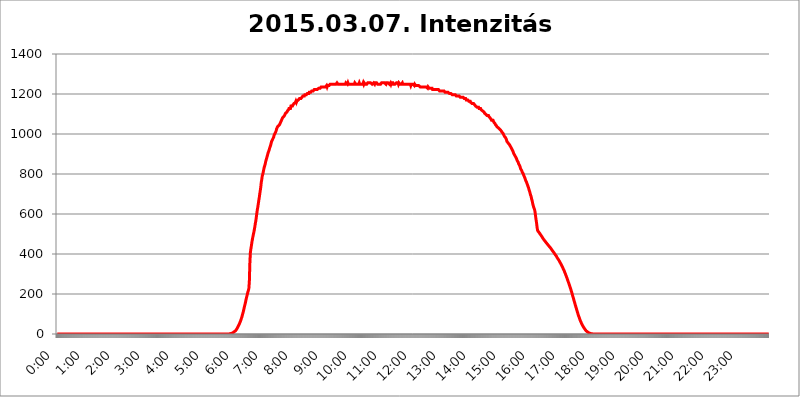
| Category | 2015.03.07. Intenzitás [W/m^2] |
|---|---|
| 0.0 | -0.256 |
| 0.0006944444444444445 | -0.256 |
| 0.001388888888888889 | -0.256 |
| 0.0020833333333333333 | -0.256 |
| 0.002777777777777778 | -0.256 |
| 0.003472222222222222 | -0.256 |
| 0.004166666666666667 | -0.256 |
| 0.004861111111111111 | -0.256 |
| 0.005555555555555556 | -0.256 |
| 0.0062499999999999995 | -0.256 |
| 0.006944444444444444 | -0.256 |
| 0.007638888888888889 | -0.256 |
| 0.008333333333333333 | -0.256 |
| 0.009027777777777779 | -0.256 |
| 0.009722222222222222 | -0.256 |
| 0.010416666666666666 | -0.256 |
| 0.011111111111111112 | -0.256 |
| 0.011805555555555555 | -0.256 |
| 0.012499999999999999 | -0.256 |
| 0.013194444444444444 | -0.256 |
| 0.013888888888888888 | -0.256 |
| 0.014583333333333332 | -0.256 |
| 0.015277777777777777 | -0.256 |
| 0.015972222222222224 | -0.256 |
| 0.016666666666666666 | -0.256 |
| 0.017361111111111112 | -0.256 |
| 0.018055555555555557 | -0.256 |
| 0.01875 | -0.256 |
| 0.019444444444444445 | -0.256 |
| 0.02013888888888889 | -0.256 |
| 0.020833333333333332 | -0.256 |
| 0.02152777777777778 | -0.256 |
| 0.022222222222222223 | -0.256 |
| 0.02291666666666667 | -0.256 |
| 0.02361111111111111 | -0.256 |
| 0.024305555555555556 | -0.256 |
| 0.024999999999999998 | -0.256 |
| 0.025694444444444447 | -0.256 |
| 0.02638888888888889 | -0.256 |
| 0.027083333333333334 | -0.256 |
| 0.027777777777777776 | -0.256 |
| 0.02847222222222222 | -0.256 |
| 0.029166666666666664 | -0.256 |
| 0.029861111111111113 | -0.256 |
| 0.030555555555555555 | -0.256 |
| 0.03125 | -0.256 |
| 0.03194444444444445 | -0.256 |
| 0.03263888888888889 | -0.256 |
| 0.03333333333333333 | -0.256 |
| 0.034027777777777775 | -0.256 |
| 0.034722222222222224 | -0.256 |
| 0.035416666666666666 | -0.256 |
| 0.036111111111111115 | -0.256 |
| 0.03680555555555556 | -0.256 |
| 0.0375 | -0.256 |
| 0.03819444444444444 | -0.256 |
| 0.03888888888888889 | -0.256 |
| 0.03958333333333333 | -0.256 |
| 0.04027777777777778 | -0.256 |
| 0.04097222222222222 | -0.256 |
| 0.041666666666666664 | -0.256 |
| 0.042361111111111106 | -0.256 |
| 0.04305555555555556 | -0.256 |
| 0.043750000000000004 | -0.256 |
| 0.044444444444444446 | -0.256 |
| 0.04513888888888889 | -0.256 |
| 0.04583333333333334 | -0.256 |
| 0.04652777777777778 | -0.256 |
| 0.04722222222222222 | -0.256 |
| 0.04791666666666666 | -0.256 |
| 0.04861111111111111 | -0.256 |
| 0.049305555555555554 | -0.256 |
| 0.049999999999999996 | -0.256 |
| 0.05069444444444445 | -0.256 |
| 0.051388888888888894 | -0.256 |
| 0.052083333333333336 | -0.256 |
| 0.05277777777777778 | -0.256 |
| 0.05347222222222222 | -0.256 |
| 0.05416666666666667 | -0.256 |
| 0.05486111111111111 | -0.256 |
| 0.05555555555555555 | -0.256 |
| 0.05625 | -0.256 |
| 0.05694444444444444 | -0.256 |
| 0.057638888888888885 | -0.256 |
| 0.05833333333333333 | -0.256 |
| 0.05902777777777778 | -0.256 |
| 0.059722222222222225 | -0.256 |
| 0.06041666666666667 | -0.256 |
| 0.061111111111111116 | -0.256 |
| 0.06180555555555556 | -0.256 |
| 0.0625 | -0.256 |
| 0.06319444444444444 | -0.256 |
| 0.06388888888888888 | -0.256 |
| 0.06458333333333334 | -0.256 |
| 0.06527777777777778 | -0.256 |
| 0.06597222222222222 | -0.256 |
| 0.06666666666666667 | -0.256 |
| 0.06736111111111111 | -0.256 |
| 0.06805555555555555 | -0.256 |
| 0.06874999999999999 | -0.256 |
| 0.06944444444444443 | -0.256 |
| 0.07013888888888889 | -0.256 |
| 0.07083333333333333 | -0.256 |
| 0.07152777777777779 | -0.256 |
| 0.07222222222222223 | -0.256 |
| 0.07291666666666667 | -0.256 |
| 0.07361111111111111 | -0.256 |
| 0.07430555555555556 | -0.256 |
| 0.075 | -0.256 |
| 0.07569444444444444 | -0.256 |
| 0.0763888888888889 | -0.256 |
| 0.07708333333333334 | -0.256 |
| 0.07777777777777778 | -0.256 |
| 0.07847222222222222 | -0.256 |
| 0.07916666666666666 | -0.256 |
| 0.0798611111111111 | -0.256 |
| 0.08055555555555556 | -0.256 |
| 0.08125 | -0.256 |
| 0.08194444444444444 | -0.256 |
| 0.08263888888888889 | -0.256 |
| 0.08333333333333333 | -0.256 |
| 0.08402777777777777 | -0.256 |
| 0.08472222222222221 | -0.256 |
| 0.08541666666666665 | -0.256 |
| 0.08611111111111112 | -0.256 |
| 0.08680555555555557 | -0.256 |
| 0.08750000000000001 | -0.256 |
| 0.08819444444444445 | -0.256 |
| 0.08888888888888889 | -0.256 |
| 0.08958333333333333 | -0.256 |
| 0.09027777777777778 | -0.256 |
| 0.09097222222222222 | -0.256 |
| 0.09166666666666667 | -0.256 |
| 0.09236111111111112 | -0.256 |
| 0.09305555555555556 | -0.256 |
| 0.09375 | -0.256 |
| 0.09444444444444444 | -0.256 |
| 0.09513888888888888 | -0.256 |
| 0.09583333333333333 | -0.256 |
| 0.09652777777777777 | -0.256 |
| 0.09722222222222222 | -0.256 |
| 0.09791666666666667 | -0.256 |
| 0.09861111111111111 | -0.256 |
| 0.09930555555555555 | -0.256 |
| 0.09999999999999999 | -0.256 |
| 0.10069444444444443 | -0.256 |
| 0.1013888888888889 | -0.256 |
| 0.10208333333333335 | -0.256 |
| 0.10277777777777779 | -0.256 |
| 0.10347222222222223 | -0.256 |
| 0.10416666666666667 | -0.256 |
| 0.10486111111111111 | -0.256 |
| 0.10555555555555556 | -0.256 |
| 0.10625 | -0.256 |
| 0.10694444444444444 | -0.256 |
| 0.1076388888888889 | -0.256 |
| 0.10833333333333334 | -0.256 |
| 0.10902777777777778 | -0.256 |
| 0.10972222222222222 | -0.256 |
| 0.1111111111111111 | -0.256 |
| 0.11180555555555556 | -0.256 |
| 0.11180555555555556 | -0.256 |
| 0.1125 | -0.256 |
| 0.11319444444444444 | -0.256 |
| 0.11388888888888889 | -0.256 |
| 0.11458333333333333 | -0.256 |
| 0.11527777777777777 | -0.256 |
| 0.11597222222222221 | -0.256 |
| 0.11666666666666665 | -0.256 |
| 0.1173611111111111 | -0.256 |
| 0.11805555555555557 | -0.256 |
| 0.11944444444444445 | -0.256 |
| 0.12013888888888889 | -0.256 |
| 0.12083333333333333 | -0.256 |
| 0.12152777777777778 | -0.256 |
| 0.12222222222222223 | -0.256 |
| 0.12291666666666667 | -0.256 |
| 0.12291666666666667 | -0.256 |
| 0.12361111111111112 | -0.256 |
| 0.12430555555555556 | -0.256 |
| 0.125 | -0.256 |
| 0.12569444444444444 | -0.256 |
| 0.12638888888888888 | -0.256 |
| 0.12708333333333333 | -0.256 |
| 0.16875 | -0.256 |
| 0.12847222222222224 | -0.256 |
| 0.12916666666666668 | -0.256 |
| 0.12986111111111112 | -0.256 |
| 0.13055555555555556 | -0.256 |
| 0.13125 | -0.256 |
| 0.13194444444444445 | -0.256 |
| 0.1326388888888889 | -0.256 |
| 0.13333333333333333 | -0.256 |
| 0.13402777777777777 | -0.256 |
| 0.13402777777777777 | -0.256 |
| 0.13472222222222222 | -0.256 |
| 0.13541666666666666 | -0.256 |
| 0.1361111111111111 | -0.256 |
| 0.13749999999999998 | -0.256 |
| 0.13819444444444443 | -0.256 |
| 0.1388888888888889 | -0.256 |
| 0.13958333333333334 | -0.256 |
| 0.14027777777777778 | -0.256 |
| 0.14097222222222222 | -0.256 |
| 0.14166666666666666 | -0.256 |
| 0.1423611111111111 | -0.256 |
| 0.14305555555555557 | -0.256 |
| 0.14375000000000002 | -0.256 |
| 0.14444444444444446 | -0.256 |
| 0.1451388888888889 | -0.256 |
| 0.1451388888888889 | -0.256 |
| 0.14652777777777778 | -0.256 |
| 0.14722222222222223 | -0.256 |
| 0.14791666666666667 | -0.256 |
| 0.1486111111111111 | -0.256 |
| 0.14930555555555555 | -0.256 |
| 0.15 | -0.256 |
| 0.15069444444444444 | -0.256 |
| 0.15138888888888888 | -0.256 |
| 0.15208333333333332 | -0.256 |
| 0.15277777777777776 | -0.256 |
| 0.15347222222222223 | -0.256 |
| 0.15416666666666667 | -0.256 |
| 0.15486111111111112 | -0.256 |
| 0.15555555555555556 | -0.256 |
| 0.15625 | -0.256 |
| 0.15694444444444444 | -0.256 |
| 0.15763888888888888 | -0.256 |
| 0.15833333333333333 | -0.256 |
| 0.15902777777777777 | -0.256 |
| 0.15972222222222224 | -0.256 |
| 0.16041666666666668 | -0.256 |
| 0.16111111111111112 | -0.256 |
| 0.16180555555555556 | -0.256 |
| 0.1625 | -0.256 |
| 0.16319444444444445 | -0.256 |
| 0.1638888888888889 | -0.256 |
| 0.16458333333333333 | -0.256 |
| 0.16527777777777777 | -0.256 |
| 0.16597222222222222 | -0.256 |
| 0.16666666666666666 | -0.256 |
| 0.1673611111111111 | -0.256 |
| 0.16805555555555554 | -0.256 |
| 0.16874999999999998 | -0.256 |
| 0.16944444444444443 | -0.256 |
| 0.17013888888888887 | -0.256 |
| 0.1708333333333333 | -0.256 |
| 0.17152777777777775 | -0.256 |
| 0.17222222222222225 | -0.256 |
| 0.1729166666666667 | -0.256 |
| 0.17361111111111113 | -0.256 |
| 0.17430555555555557 | -0.256 |
| 0.17500000000000002 | -0.256 |
| 0.17569444444444446 | -0.256 |
| 0.1763888888888889 | -0.256 |
| 0.17708333333333334 | -0.256 |
| 0.17777777777777778 | -0.256 |
| 0.17847222222222223 | -0.256 |
| 0.17916666666666667 | -0.256 |
| 0.1798611111111111 | -0.256 |
| 0.18055555555555555 | -0.256 |
| 0.18125 | -0.256 |
| 0.18194444444444444 | -0.256 |
| 0.1826388888888889 | -0.256 |
| 0.18333333333333335 | -0.256 |
| 0.1840277777777778 | -0.256 |
| 0.18472222222222223 | -0.256 |
| 0.18541666666666667 | -0.256 |
| 0.18611111111111112 | -0.256 |
| 0.18680555555555556 | -0.256 |
| 0.1875 | -0.256 |
| 0.18819444444444444 | -0.256 |
| 0.18888888888888888 | -0.256 |
| 0.18958333333333333 | -0.256 |
| 0.19027777777777777 | -0.256 |
| 0.1909722222222222 | -0.256 |
| 0.19166666666666665 | -0.256 |
| 0.19236111111111112 | -0.256 |
| 0.19305555555555554 | -0.256 |
| 0.19375 | -0.256 |
| 0.19444444444444445 | -0.256 |
| 0.1951388888888889 | -0.256 |
| 0.19583333333333333 | -0.256 |
| 0.19652777777777777 | -0.256 |
| 0.19722222222222222 | -0.256 |
| 0.19791666666666666 | -0.256 |
| 0.1986111111111111 | -0.256 |
| 0.19930555555555554 | -0.256 |
| 0.19999999999999998 | -0.256 |
| 0.20069444444444443 | -0.256 |
| 0.20138888888888887 | -0.256 |
| 0.2020833333333333 | -0.256 |
| 0.2027777777777778 | -0.256 |
| 0.2034722222222222 | -0.256 |
| 0.2041666666666667 | -0.256 |
| 0.20486111111111113 | -0.256 |
| 0.20555555555555557 | -0.256 |
| 0.20625000000000002 | -0.256 |
| 0.20694444444444446 | -0.256 |
| 0.2076388888888889 | -0.256 |
| 0.20833333333333334 | -0.256 |
| 0.20902777777777778 | -0.256 |
| 0.20972222222222223 | -0.256 |
| 0.21041666666666667 | -0.256 |
| 0.2111111111111111 | -0.256 |
| 0.21180555555555555 | -0.256 |
| 0.2125 | -0.256 |
| 0.21319444444444444 | -0.256 |
| 0.2138888888888889 | -0.256 |
| 0.21458333333333335 | -0.256 |
| 0.2152777777777778 | -0.256 |
| 0.21597222222222223 | -0.256 |
| 0.21666666666666667 | -0.256 |
| 0.21736111111111112 | -0.256 |
| 0.21805555555555556 | -0.256 |
| 0.21875 | -0.256 |
| 0.21944444444444444 | -0.256 |
| 0.22013888888888888 | -0.256 |
| 0.22083333333333333 | -0.256 |
| 0.22152777777777777 | -0.256 |
| 0.2222222222222222 | -0.256 |
| 0.22291666666666665 | -0.256 |
| 0.2236111111111111 | -0.256 |
| 0.22430555555555556 | -0.256 |
| 0.225 | -0.256 |
| 0.22569444444444445 | -0.256 |
| 0.2263888888888889 | -0.256 |
| 0.22708333333333333 | -0.256 |
| 0.22777777777777777 | -0.256 |
| 0.22847222222222222 | -0.256 |
| 0.22916666666666666 | -0.256 |
| 0.2298611111111111 | -0.256 |
| 0.23055555555555554 | -0.256 |
| 0.23124999999999998 | -0.256 |
| 0.23194444444444443 | -0.256 |
| 0.23263888888888887 | -0.256 |
| 0.2333333333333333 | -0.256 |
| 0.2340277777777778 | -0.256 |
| 0.2347222222222222 | -0.256 |
| 0.2354166666666667 | -0.256 |
| 0.23611111111111113 | -0.256 |
| 0.23680555555555557 | -0.256 |
| 0.23750000000000002 | -0.256 |
| 0.23819444444444446 | -0.256 |
| 0.2388888888888889 | -0.256 |
| 0.23958333333333334 | -0.256 |
| 0.24027777777777778 | -0.256 |
| 0.24097222222222223 | 1.09 |
| 0.24166666666666667 | 1.09 |
| 0.2423611111111111 | 1.09 |
| 0.24305555555555555 | 2.439 |
| 0.24375 | 2.439 |
| 0.24444444444444446 | 3.791 |
| 0.24513888888888888 | 3.791 |
| 0.24583333333333335 | 5.146 |
| 0.2465277777777778 | 6.503 |
| 0.24722222222222223 | 7.862 |
| 0.24791666666666667 | 10.589 |
| 0.24861111111111112 | 11.956 |
| 0.24930555555555556 | 14.696 |
| 0.25 | 16.069 |
| 0.25069444444444444 | 20.201 |
| 0.2513888888888889 | 22.965 |
| 0.2520833333333333 | 27.124 |
| 0.25277777777777777 | 31.297 |
| 0.2534722222222222 | 35.483 |
| 0.25416666666666665 | 41.081 |
| 0.2548611111111111 | 45.29 |
| 0.2555555555555556 | 50.914 |
| 0.25625000000000003 | 57.958 |
| 0.2569444444444445 | 63.6 |
| 0.2576388888888889 | 70.658 |
| 0.25833333333333336 | 79.125 |
| 0.2590277777777778 | 86.175 |
| 0.25972222222222224 | 96.022 |
| 0.2604166666666667 | 104.435 |
| 0.2611111111111111 | 114.207 |
| 0.26180555555555557 | 125.304 |
| 0.2625 | 136.314 |
| 0.26319444444444445 | 145.865 |
| 0.2638888888888889 | 156.678 |
| 0.26458333333333334 | 168.703 |
| 0.2652777777777778 | 179.258 |
| 0.2659722222222222 | 189.685 |
| 0.26666666666666666 | 199.98 |
| 0.2673611111111111 | 210.144 |
| 0.26805555555555555 | 217.681 |
| 0.26875 | 227.618 |
| 0.26944444444444443 | 263.851 |
| 0.2701388888888889 | 352.423 |
| 0.2708333333333333 | 406.25 |
| 0.27152777777777776 | 424.085 |
| 0.2722222222222222 | 439.982 |
| 0.27291666666666664 | 456.747 |
| 0.2736111111111111 | 471.198 |
| 0.2743055555555555 | 484.662 |
| 0.27499999999999997 | 496.965 |
| 0.27569444444444446 | 507.927 |
| 0.27638888888888885 | 521.237 |
| 0.27708333333333335 | 535.145 |
| 0.2777777777777778 | 551.823 |
| 0.27847222222222223 | 564.917 |
| 0.2791666666666667 | 583.206 |
| 0.2798611111111111 | 602.505 |
| 0.28055555555555556 | 620.273 |
| 0.28125 | 633.495 |
| 0.28194444444444444 | 649.973 |
| 0.2826388888888889 | 667.146 |
| 0.2833333333333333 | 682.011 |
| 0.28402777777777777 | 700.54 |
| 0.2847222222222222 | 716.58 |
| 0.28541666666666665 | 733.184 |
| 0.28611111111111115 | 757.414 |
| 0.28680555555555554 | 771.794 |
| 0.28750000000000003 | 790.334 |
| 0.2881944444444445 | 797.931 |
| 0.2888888888888889 | 809.522 |
| 0.28958333333333336 | 821.353 |
| 0.2902777777777778 | 833.43 |
| 0.29097222222222224 | 841.619 |
| 0.2916666666666667 | 849.92 |
| 0.2923611111111111 | 862.585 |
| 0.29305555555555557 | 866.865 |
| 0.29375 | 879.878 |
| 0.29444444444444445 | 888.701 |
| 0.2951388888888889 | 893.157 |
| 0.29583333333333334 | 906.707 |
| 0.2965277777777778 | 911.285 |
| 0.2972222222222222 | 920.533 |
| 0.29791666666666666 | 929.905 |
| 0.2986111111111111 | 934.639 |
| 0.29930555555555555 | 944.201 |
| 0.3 | 949.03 |
| 0.30069444444444443 | 963.712 |
| 0.3013888888888889 | 968.671 |
| 0.3020833333333333 | 973.663 |
| 0.30277777777777776 | 978.688 |
| 0.3034722222222222 | 983.747 |
| 0.30416666666666664 | 993.965 |
| 0.3048611111111111 | 993.965 |
| 0.3055555555555555 | 1004.318 |
| 0.30624999999999997 | 1009.546 |
| 0.3069444444444444 | 1014.809 |
| 0.3076388888888889 | 1025.437 |
| 0.30833333333333335 | 1025.437 |
| 0.3090277777777778 | 1036.206 |
| 0.30972222222222223 | 1036.206 |
| 0.3104166666666667 | 1041.644 |
| 0.3111111111111111 | 1041.644 |
| 0.31180555555555556 | 1047.117 |
| 0.3125 | 1052.625 |
| 0.31319444444444444 | 1058.17 |
| 0.3138888888888889 | 1058.17 |
| 0.3145833333333333 | 1069.368 |
| 0.31527777777777777 | 1075.021 |
| 0.3159722222222222 | 1080.711 |
| 0.31666666666666665 | 1080.711 |
| 0.31736111111111115 | 1086.439 |
| 0.31805555555555554 | 1086.439 |
| 0.31875000000000003 | 1092.203 |
| 0.3194444444444445 | 1092.203 |
| 0.3201388888888889 | 1103.843 |
| 0.32083333333333336 | 1103.843 |
| 0.3215277777777778 | 1103.843 |
| 0.32222222222222224 | 1109.72 |
| 0.3229166666666667 | 1115.634 |
| 0.3236111111111111 | 1115.634 |
| 0.32430555555555557 | 1121.587 |
| 0.325 | 1127.578 |
| 0.32569444444444445 | 1127.578 |
| 0.3263888888888889 | 1127.578 |
| 0.32708333333333334 | 1127.578 |
| 0.3277777777777778 | 1139.675 |
| 0.3284722222222222 | 1139.675 |
| 0.32916666666666666 | 1139.675 |
| 0.3298611111111111 | 1139.675 |
| 0.33055555555555555 | 1145.782 |
| 0.33125 | 1145.782 |
| 0.33194444444444443 | 1151.928 |
| 0.3326388888888889 | 1151.928 |
| 0.3333333333333333 | 1151.928 |
| 0.3340277777777778 | 1158.113 |
| 0.3347222222222222 | 1164.337 |
| 0.3354166666666667 | 1158.113 |
| 0.3361111111111111 | 1164.337 |
| 0.3368055555555556 | 1164.337 |
| 0.33749999999999997 | 1164.337 |
| 0.33819444444444446 | 1170.601 |
| 0.33888888888888885 | 1170.601 |
| 0.33958333333333335 | 1176.905 |
| 0.34027777777777773 | 1176.905 |
| 0.34097222222222223 | 1176.905 |
| 0.3416666666666666 | 1176.905 |
| 0.3423611111111111 | 1176.905 |
| 0.3430555555555555 | 1183.249 |
| 0.34375 | 1183.249 |
| 0.3444444444444445 | 1189.633 |
| 0.3451388888888889 | 1189.633 |
| 0.3458333333333334 | 1189.633 |
| 0.34652777777777777 | 1189.633 |
| 0.34722222222222227 | 1196.058 |
| 0.34791666666666665 | 1196.058 |
| 0.34861111111111115 | 1196.058 |
| 0.34930555555555554 | 1196.058 |
| 0.35000000000000003 | 1196.058 |
| 0.3506944444444444 | 1202.523 |
| 0.3513888888888889 | 1202.523 |
| 0.3520833333333333 | 1202.523 |
| 0.3527777777777778 | 1202.523 |
| 0.3534722222222222 | 1209.029 |
| 0.3541666666666667 | 1209.029 |
| 0.3548611111111111 | 1209.029 |
| 0.35555555555555557 | 1209.029 |
| 0.35625 | 1209.029 |
| 0.35694444444444445 | 1215.576 |
| 0.3576388888888889 | 1215.576 |
| 0.35833333333333334 | 1215.576 |
| 0.3590277777777778 | 1215.576 |
| 0.3597222222222222 | 1215.576 |
| 0.36041666666666666 | 1222.164 |
| 0.3611111111111111 | 1222.164 |
| 0.36180555555555555 | 1222.164 |
| 0.3625 | 1222.164 |
| 0.36319444444444443 | 1222.164 |
| 0.3638888888888889 | 1222.164 |
| 0.3645833333333333 | 1222.164 |
| 0.3652777777777778 | 1222.164 |
| 0.3659722222222222 | 1222.164 |
| 0.3666666666666667 | 1228.794 |
| 0.3673611111111111 | 1228.794 |
| 0.3680555555555556 | 1228.794 |
| 0.36874999999999997 | 1228.794 |
| 0.36944444444444446 | 1228.794 |
| 0.37013888888888885 | 1235.465 |
| 0.37083333333333335 | 1235.465 |
| 0.37152777777777773 | 1235.465 |
| 0.37222222222222223 | 1235.465 |
| 0.3729166666666666 | 1235.465 |
| 0.3736111111111111 | 1235.465 |
| 0.3743055555555555 | 1235.465 |
| 0.375 | 1235.465 |
| 0.3756944444444445 | 1235.465 |
| 0.3763888888888889 | 1235.465 |
| 0.3770833333333334 | 1235.465 |
| 0.37777777777777777 | 1242.179 |
| 0.37847222222222227 | 1235.465 |
| 0.37916666666666665 | 1242.179 |
| 0.37986111111111115 | 1242.179 |
| 0.38055555555555554 | 1242.179 |
| 0.38125000000000003 | 1242.179 |
| 0.3819444444444444 | 1242.179 |
| 0.3826388888888889 | 1248.934 |
| 0.3833333333333333 | 1248.934 |
| 0.3840277777777778 | 1248.934 |
| 0.3847222222222222 | 1248.934 |
| 0.3854166666666667 | 1248.934 |
| 0.3861111111111111 | 1248.934 |
| 0.38680555555555557 | 1248.934 |
| 0.3875 | 1248.934 |
| 0.38819444444444445 | 1248.934 |
| 0.3888888888888889 | 1248.934 |
| 0.38958333333333334 | 1248.934 |
| 0.3902777777777778 | 1248.934 |
| 0.3909722222222222 | 1248.934 |
| 0.39166666666666666 | 1248.934 |
| 0.3923611111111111 | 1255.731 |
| 0.39305555555555555 | 1255.731 |
| 0.39375 | 1248.934 |
| 0.39444444444444443 | 1248.934 |
| 0.3951388888888889 | 1248.934 |
| 0.3958333333333333 | 1248.934 |
| 0.3965277777777778 | 1248.934 |
| 0.3972222222222222 | 1248.934 |
| 0.3979166666666667 | 1248.934 |
| 0.3986111111111111 | 1248.934 |
| 0.3993055555555556 | 1248.934 |
| 0.39999999999999997 | 1248.934 |
| 0.40069444444444446 | 1248.934 |
| 0.40138888888888885 | 1248.934 |
| 0.40208333333333335 | 1248.934 |
| 0.40277777777777773 | 1248.934 |
| 0.40347222222222223 | 1248.934 |
| 0.4041666666666666 | 1248.934 |
| 0.4048611111111111 | 1255.731 |
| 0.4055555555555555 | 1255.731 |
| 0.40625 | 1255.731 |
| 0.4069444444444445 | 1248.934 |
| 0.4076388888888889 | 1255.731 |
| 0.4083333333333334 | 1248.934 |
| 0.40902777777777777 | 1248.934 |
| 0.40972222222222227 | 1248.934 |
| 0.41041666666666665 | 1248.934 |
| 0.41111111111111115 | 1248.934 |
| 0.41180555555555554 | 1248.934 |
| 0.41250000000000003 | 1248.934 |
| 0.4131944444444444 | 1248.934 |
| 0.4138888888888889 | 1248.934 |
| 0.4145833333333333 | 1248.934 |
| 0.4152777777777778 | 1248.934 |
| 0.4159722222222222 | 1248.934 |
| 0.4166666666666667 | 1248.934 |
| 0.4173611111111111 | 1255.731 |
| 0.41805555555555557 | 1255.731 |
| 0.41875 | 1248.934 |
| 0.41944444444444445 | 1248.934 |
| 0.4201388888888889 | 1248.934 |
| 0.42083333333333334 | 1248.934 |
| 0.4215277777777778 | 1248.934 |
| 0.4222222222222222 | 1248.934 |
| 0.42291666666666666 | 1248.934 |
| 0.4236111111111111 | 1255.731 |
| 0.42430555555555555 | 1248.934 |
| 0.425 | 1248.934 |
| 0.42569444444444443 | 1248.934 |
| 0.4263888888888889 | 1248.934 |
| 0.4270833333333333 | 1248.934 |
| 0.4277777777777778 | 1248.934 |
| 0.4284722222222222 | 1248.934 |
| 0.4291666666666667 | 1255.731 |
| 0.4298611111111111 | 1248.934 |
| 0.4305555555555556 | 1255.731 |
| 0.43124999999999997 | 1255.731 |
| 0.43194444444444446 | 1248.934 |
| 0.43263888888888885 | 1248.934 |
| 0.43333333333333335 | 1248.934 |
| 0.43402777777777773 | 1248.934 |
| 0.43472222222222223 | 1248.934 |
| 0.4354166666666666 | 1255.731 |
| 0.4361111111111111 | 1255.731 |
| 0.4368055555555555 | 1255.731 |
| 0.4375 | 1255.731 |
| 0.4381944444444445 | 1255.731 |
| 0.4388888888888889 | 1255.731 |
| 0.4395833333333334 | 1255.731 |
| 0.44027777777777777 | 1255.731 |
| 0.44097222222222227 | 1255.731 |
| 0.44166666666666665 | 1248.934 |
| 0.44236111111111115 | 1248.934 |
| 0.44305555555555554 | 1248.934 |
| 0.44375000000000003 | 1255.731 |
| 0.4444444444444444 | 1255.731 |
| 0.4451388888888889 | 1248.934 |
| 0.4458333333333333 | 1255.731 |
| 0.4465277777777778 | 1255.731 |
| 0.4472222222222222 | 1255.731 |
| 0.4479166666666667 | 1255.731 |
| 0.4486111111111111 | 1255.731 |
| 0.44930555555555557 | 1248.934 |
| 0.45 | 1248.934 |
| 0.45069444444444445 | 1248.934 |
| 0.4513888888888889 | 1248.934 |
| 0.45208333333333334 | 1248.934 |
| 0.4527777777777778 | 1248.934 |
| 0.4534722222222222 | 1248.934 |
| 0.45416666666666666 | 1248.934 |
| 0.4548611111111111 | 1255.731 |
| 0.45555555555555555 | 1255.731 |
| 0.45625 | 1255.731 |
| 0.45694444444444443 | 1255.731 |
| 0.4576388888888889 | 1255.731 |
| 0.4583333333333333 | 1255.731 |
| 0.4590277777777778 | 1255.731 |
| 0.4597222222222222 | 1255.731 |
| 0.4604166666666667 | 1255.731 |
| 0.4611111111111111 | 1248.934 |
| 0.4618055555555556 | 1255.731 |
| 0.46249999999999997 | 1255.731 |
| 0.46319444444444446 | 1255.731 |
| 0.46388888888888885 | 1255.731 |
| 0.46458333333333335 | 1255.731 |
| 0.46527777777777773 | 1255.731 |
| 0.46597222222222223 | 1248.934 |
| 0.4666666666666666 | 1248.934 |
| 0.4673611111111111 | 1255.731 |
| 0.4680555555555555 | 1248.934 |
| 0.46875 | 1255.731 |
| 0.4694444444444445 | 1255.731 |
| 0.4701388888888889 | 1255.731 |
| 0.4708333333333334 | 1255.731 |
| 0.47152777777777777 | 1248.934 |
| 0.47222222222222227 | 1248.934 |
| 0.47291666666666665 | 1248.934 |
| 0.47361111111111115 | 1248.934 |
| 0.47430555555555554 | 1248.934 |
| 0.47500000000000003 | 1248.934 |
| 0.4756944444444444 | 1255.731 |
| 0.4763888888888889 | 1255.731 |
| 0.4770833333333333 | 1255.731 |
| 0.4777777777777778 | 1255.731 |
| 0.4784722222222222 | 1248.934 |
| 0.4791666666666667 | 1255.731 |
| 0.4798611111111111 | 1255.731 |
| 0.48055555555555557 | 1248.934 |
| 0.48125 | 1248.934 |
| 0.48194444444444445 | 1248.934 |
| 0.4826388888888889 | 1248.934 |
| 0.48333333333333334 | 1248.934 |
| 0.4840277777777778 | 1255.731 |
| 0.4847222222222222 | 1248.934 |
| 0.48541666666666666 | 1248.934 |
| 0.4861111111111111 | 1248.934 |
| 0.48680555555555555 | 1248.934 |
| 0.4875 | 1248.934 |
| 0.48819444444444443 | 1248.934 |
| 0.4888888888888889 | 1248.934 |
| 0.4895833333333333 | 1248.934 |
| 0.4902777777777778 | 1248.934 |
| 0.4909722222222222 | 1248.934 |
| 0.4916666666666667 | 1248.934 |
| 0.4923611111111111 | 1248.934 |
| 0.4930555555555556 | 1248.934 |
| 0.49374999999999997 | 1248.934 |
| 0.49444444444444446 | 1248.934 |
| 0.49513888888888885 | 1248.934 |
| 0.49583333333333335 | 1242.179 |
| 0.49652777777777773 | 1248.934 |
| 0.49722222222222223 | 1248.934 |
| 0.4979166666666666 | 1248.934 |
| 0.4986111111111111 | 1248.934 |
| 0.4993055555555555 | 1248.934 |
| 0.5 | 1248.934 |
| 0.5006944444444444 | 1242.179 |
| 0.5013888888888889 | 1248.934 |
| 0.5020833333333333 | 1248.934 |
| 0.5027777777777778 | 1242.179 |
| 0.5034722222222222 | 1242.179 |
| 0.5041666666666667 | 1242.179 |
| 0.5048611111111111 | 1242.179 |
| 0.5055555555555555 | 1242.179 |
| 0.50625 | 1242.179 |
| 0.5069444444444444 | 1242.179 |
| 0.5076388888888889 | 1242.179 |
| 0.5083333333333333 | 1242.179 |
| 0.5090277777777777 | 1235.465 |
| 0.5097222222222222 | 1235.465 |
| 0.5104166666666666 | 1235.465 |
| 0.5111111111111112 | 1235.465 |
| 0.5118055555555555 | 1235.465 |
| 0.5125000000000001 | 1235.465 |
| 0.5131944444444444 | 1235.465 |
| 0.513888888888889 | 1235.465 |
| 0.5145833333333333 | 1235.465 |
| 0.5152777777777778 | 1235.465 |
| 0.5159722222222222 | 1235.465 |
| 0.5166666666666667 | 1235.465 |
| 0.517361111111111 | 1235.465 |
| 0.5180555555555556 | 1235.465 |
| 0.5187499999999999 | 1235.465 |
| 0.5194444444444445 | 1228.794 |
| 0.5201388888888888 | 1235.465 |
| 0.5208333333333334 | 1235.465 |
| 0.5215277777777778 | 1228.794 |
| 0.5222222222222223 | 1228.794 |
| 0.5229166666666667 | 1228.794 |
| 0.5236111111111111 | 1228.794 |
| 0.5243055555555556 | 1228.794 |
| 0.525 | 1228.794 |
| 0.5256944444444445 | 1228.794 |
| 0.5263888888888889 | 1222.164 |
| 0.5270833333333333 | 1222.164 |
| 0.5277777777777778 | 1222.164 |
| 0.5284722222222222 | 1222.164 |
| 0.5291666666666667 | 1222.164 |
| 0.5298611111111111 | 1222.164 |
| 0.5305555555555556 | 1222.164 |
| 0.53125 | 1222.164 |
| 0.5319444444444444 | 1222.164 |
| 0.5326388888888889 | 1222.164 |
| 0.5333333333333333 | 1222.164 |
| 0.5340277777777778 | 1222.164 |
| 0.5347222222222222 | 1222.164 |
| 0.5354166666666667 | 1222.164 |
| 0.5361111111111111 | 1215.576 |
| 0.5368055555555555 | 1215.576 |
| 0.5375 | 1215.576 |
| 0.5381944444444444 | 1215.576 |
| 0.5388888888888889 | 1215.576 |
| 0.5395833333333333 | 1215.576 |
| 0.5402777777777777 | 1215.576 |
| 0.5409722222222222 | 1215.576 |
| 0.5416666666666666 | 1215.576 |
| 0.5423611111111112 | 1215.576 |
| 0.5430555555555555 | 1215.576 |
| 0.5437500000000001 | 1209.029 |
| 0.5444444444444444 | 1209.029 |
| 0.545138888888889 | 1209.029 |
| 0.5458333333333333 | 1209.029 |
| 0.5465277777777778 | 1209.029 |
| 0.5472222222222222 | 1209.029 |
| 0.5479166666666667 | 1209.029 |
| 0.548611111111111 | 1209.029 |
| 0.5493055555555556 | 1209.029 |
| 0.5499999999999999 | 1202.523 |
| 0.5506944444444445 | 1202.523 |
| 0.5513888888888888 | 1202.523 |
| 0.5520833333333334 | 1202.523 |
| 0.5527777777777778 | 1202.523 |
| 0.5534722222222223 | 1202.523 |
| 0.5541666666666667 | 1196.058 |
| 0.5548611111111111 | 1196.058 |
| 0.5555555555555556 | 1196.058 |
| 0.55625 | 1196.058 |
| 0.5569444444444445 | 1196.058 |
| 0.5576388888888889 | 1196.058 |
| 0.5583333333333333 | 1196.058 |
| 0.5590277777777778 | 1196.058 |
| 0.5597222222222222 | 1189.633 |
| 0.5604166666666667 | 1189.633 |
| 0.5611111111111111 | 1189.633 |
| 0.5618055555555556 | 1189.633 |
| 0.5625 | 1189.633 |
| 0.5631944444444444 | 1189.633 |
| 0.5638888888888889 | 1189.633 |
| 0.5645833333333333 | 1189.633 |
| 0.5652777777777778 | 1183.249 |
| 0.5659722222222222 | 1183.249 |
| 0.5666666666666667 | 1183.249 |
| 0.5673611111111111 | 1183.249 |
| 0.5680555555555555 | 1183.249 |
| 0.56875 | 1183.249 |
| 0.5694444444444444 | 1183.249 |
| 0.5701388888888889 | 1183.249 |
| 0.5708333333333333 | 1176.905 |
| 0.5715277777777777 | 1176.905 |
| 0.5722222222222222 | 1176.905 |
| 0.5729166666666666 | 1176.905 |
| 0.5736111111111112 | 1170.601 |
| 0.5743055555555555 | 1170.601 |
| 0.5750000000000001 | 1170.601 |
| 0.5756944444444444 | 1170.601 |
| 0.576388888888889 | 1170.601 |
| 0.5770833333333333 | 1164.337 |
| 0.5777777777777778 | 1164.337 |
| 0.5784722222222222 | 1164.337 |
| 0.5791666666666667 | 1164.337 |
| 0.579861111111111 | 1158.113 |
| 0.5805555555555556 | 1158.113 |
| 0.5812499999999999 | 1158.113 |
| 0.5819444444444445 | 1151.928 |
| 0.5826388888888888 | 1151.928 |
| 0.5833333333333334 | 1151.928 |
| 0.5840277777777778 | 1151.928 |
| 0.5847222222222223 | 1151.928 |
| 0.5854166666666667 | 1145.782 |
| 0.5861111111111111 | 1145.782 |
| 0.5868055555555556 | 1139.675 |
| 0.5875 | 1139.675 |
| 0.5881944444444445 | 1139.675 |
| 0.5888888888888889 | 1133.607 |
| 0.5895833333333333 | 1133.607 |
| 0.5902777777777778 | 1133.607 |
| 0.5909722222222222 | 1133.607 |
| 0.5916666666666667 | 1127.578 |
| 0.5923611111111111 | 1127.578 |
| 0.5930555555555556 | 1127.578 |
| 0.59375 | 1127.578 |
| 0.5944444444444444 | 1121.587 |
| 0.5951388888888889 | 1121.587 |
| 0.5958333333333333 | 1121.587 |
| 0.5965277777777778 | 1115.634 |
| 0.5972222222222222 | 1115.634 |
| 0.5979166666666667 | 1115.634 |
| 0.5986111111111111 | 1109.72 |
| 0.5993055555555555 | 1103.843 |
| 0.6 | 1103.843 |
| 0.6006944444444444 | 1103.843 |
| 0.6013888888888889 | 1098.004 |
| 0.6020833333333333 | 1098.004 |
| 0.6027777777777777 | 1092.203 |
| 0.6034722222222222 | 1092.203 |
| 0.6041666666666666 | 1092.203 |
| 0.6048611111111112 | 1092.203 |
| 0.6055555555555555 | 1086.439 |
| 0.6062500000000001 | 1086.439 |
| 0.6069444444444444 | 1080.711 |
| 0.607638888888889 | 1080.711 |
| 0.6083333333333333 | 1075.021 |
| 0.6090277777777778 | 1069.368 |
| 0.6097222222222222 | 1069.368 |
| 0.6104166666666667 | 1069.368 |
| 0.611111111111111 | 1069.368 |
| 0.6118055555555556 | 1063.751 |
| 0.6124999999999999 | 1058.17 |
| 0.6131944444444445 | 1058.17 |
| 0.6138888888888888 | 1052.625 |
| 0.6145833333333334 | 1047.117 |
| 0.6152777777777778 | 1047.117 |
| 0.6159722222222223 | 1041.644 |
| 0.6166666666666667 | 1036.206 |
| 0.6173611111111111 | 1036.206 |
| 0.6180555555555556 | 1036.206 |
| 0.61875 | 1030.804 |
| 0.6194444444444445 | 1030.804 |
| 0.6201388888888889 | 1025.437 |
| 0.6208333333333333 | 1025.437 |
| 0.6215277777777778 | 1020.106 |
| 0.6222222222222222 | 1020.106 |
| 0.6229166666666667 | 1014.809 |
| 0.6236111111111111 | 1009.546 |
| 0.6243055555555556 | 1009.546 |
| 0.625 | 1004.318 |
| 0.6256944444444444 | 999.125 |
| 0.6263888888888889 | 993.965 |
| 0.6270833333333333 | 988.839 |
| 0.6277777777777778 | 988.839 |
| 0.6284722222222222 | 983.747 |
| 0.6291666666666667 | 978.688 |
| 0.6298611111111111 | 973.663 |
| 0.6305555555555555 | 963.712 |
| 0.63125 | 963.712 |
| 0.6319444444444444 | 958.785 |
| 0.6326388888888889 | 953.892 |
| 0.6333333333333333 | 953.892 |
| 0.6340277777777777 | 949.03 |
| 0.6347222222222222 | 944.201 |
| 0.6354166666666666 | 939.404 |
| 0.6361111111111112 | 934.639 |
| 0.6368055555555555 | 929.905 |
| 0.6375000000000001 | 925.203 |
| 0.6381944444444444 | 920.533 |
| 0.638888888888889 | 915.893 |
| 0.6395833333333333 | 911.285 |
| 0.6402777777777778 | 902.16 |
| 0.6409722222222222 | 902.16 |
| 0.6416666666666667 | 897.643 |
| 0.642361111111111 | 888.701 |
| 0.6430555555555556 | 884.274 |
| 0.6437499999999999 | 879.878 |
| 0.6444444444444445 | 875.511 |
| 0.6451388888888888 | 866.865 |
| 0.6458333333333334 | 862.585 |
| 0.6465277777777778 | 858.335 |
| 0.6472222222222223 | 849.92 |
| 0.6479166666666667 | 845.755 |
| 0.6486111111111111 | 841.619 |
| 0.6493055555555556 | 833.43 |
| 0.65 | 825.351 |
| 0.6506944444444445 | 821.353 |
| 0.6513888888888889 | 817.382 |
| 0.6520833333333333 | 809.522 |
| 0.6527777777777778 | 805.632 |
| 0.6534722222222222 | 801.768 |
| 0.6541666666666667 | 794.119 |
| 0.6548611111111111 | 790.334 |
| 0.6555555555555556 | 782.842 |
| 0.65625 | 775.451 |
| 0.6569444444444444 | 768.162 |
| 0.6576388888888889 | 764.555 |
| 0.6583333333333333 | 757.414 |
| 0.6590277777777778 | 750.371 |
| 0.6597222222222222 | 743.425 |
| 0.6604166666666667 | 736.574 |
| 0.6611111111111111 | 729.817 |
| 0.6618055555555555 | 719.855 |
| 0.6625 | 713.328 |
| 0.6631944444444444 | 703.704 |
| 0.6638888888888889 | 694.278 |
| 0.6645833333333333 | 688.102 |
| 0.6652777777777777 | 676.003 |
| 0.6659722222222222 | 667.146 |
| 0.6666666666666666 | 655.618 |
| 0.6673611111111111 | 644.405 |
| 0.6680555555555556 | 636.194 |
| 0.6687500000000001 | 628.152 |
| 0.6694444444444444 | 622.881 |
| 0.6701388888888888 | 610.016 |
| 0.6708333333333334 | 590.321 |
| 0.6715277777777778 | 571.661 |
| 0.6722222222222222 | 556.131 |
| 0.6729166666666666 | 535.145 |
| 0.6736111111111112 | 519.3 |
| 0.6743055555555556 | 513.561 |
| 0.6749999999999999 | 509.793 |
| 0.6756944444444444 | 507.927 |
| 0.6763888888888889 | 504.229 |
| 0.6770833333333334 | 500.575 |
| 0.6777777777777777 | 496.965 |
| 0.6784722222222223 | 493.398 |
| 0.6791666666666667 | 489.873 |
| 0.6798611111111111 | 486.389 |
| 0.6805555555555555 | 482.945 |
| 0.68125 | 477.854 |
| 0.6819444444444445 | 474.507 |
| 0.6826388888888889 | 471.198 |
| 0.6833333333333332 | 467.925 |
| 0.6840277777777778 | 464.688 |
| 0.6847222222222222 | 461.486 |
| 0.6854166666666667 | 459.898 |
| 0.686111111111111 | 455.184 |
| 0.6868055555555556 | 452.082 |
| 0.6875 | 449.011 |
| 0.6881944444444444 | 445.971 |
| 0.688888888888889 | 442.962 |
| 0.6895833333333333 | 439.982 |
| 0.6902777777777778 | 437.031 |
| 0.6909722222222222 | 434.107 |
| 0.6916666666666668 | 431.211 |
| 0.6923611111111111 | 426.916 |
| 0.6930555555555555 | 424.085 |
| 0.69375 | 421.278 |
| 0.6944444444444445 | 417.112 |
| 0.6951388888888889 | 414.364 |
| 0.6958333333333333 | 410.283 |
| 0.6965277777777777 | 406.25 |
| 0.6972222222222223 | 403.587 |
| 0.6979166666666666 | 399.628 |
| 0.6986111111111111 | 395.711 |
| 0.6993055555555556 | 391.834 |
| 0.7000000000000001 | 389.27 |
| 0.7006944444444444 | 384.191 |
| 0.7013888888888888 | 381.674 |
| 0.7020833333333334 | 376.682 |
| 0.7027777777777778 | 372.972 |
| 0.7034722222222222 | 369.291 |
| 0.7041666666666666 | 364.422 |
| 0.7048611111111112 | 359.595 |
| 0.7055555555555556 | 355.999 |
| 0.7062499999999999 | 351.235 |
| 0.7069444444444444 | 346.501 |
| 0.7076388888888889 | 341.794 |
| 0.7083333333333334 | 337.109 |
| 0.7090277777777777 | 331.279 |
| 0.7097222222222223 | 325.473 |
| 0.7104166666666667 | 320.84 |
| 0.7111111111111111 | 315.059 |
| 0.7118055555555555 | 308.129 |
| 0.7125 | 302.353 |
| 0.7131944444444445 | 295.413 |
| 0.7138888888888889 | 289.616 |
| 0.7145833333333332 | 282.637 |
| 0.7152777777777778 | 275.626 |
| 0.7159722222222222 | 268.576 |
| 0.7166666666666667 | 261.48 |
| 0.717361111111111 | 254.333 |
| 0.7180555555555556 | 247.131 |
| 0.71875 | 239.868 |
| 0.7194444444444444 | 232.54 |
| 0.720138888888889 | 225.146 |
| 0.7208333333333333 | 216.43 |
| 0.7215277777777778 | 208.881 |
| 0.7222222222222222 | 199.98 |
| 0.7229166666666668 | 190.979 |
| 0.7236111111111111 | 183.184 |
| 0.7243055555555555 | 173.996 |
| 0.725 | 164.712 |
| 0.7256944444444445 | 156.678 |
| 0.7263888888888889 | 147.223 |
| 0.7270833333333333 | 139.051 |
| 0.7277777777777777 | 130.821 |
| 0.7284722222222223 | 122.538 |
| 0.7291666666666666 | 114.207 |
| 0.7298611111111111 | 105.834 |
| 0.7305555555555556 | 97.427 |
| 0.7312500000000001 | 90.399 |
| 0.7319444444444444 | 83.356 |
| 0.7326388888888888 | 76.304 |
| 0.7333333333333334 | 69.246 |
| 0.7340277777777778 | 63.6 |
| 0.7347222222222222 | 57.958 |
| 0.7354166666666666 | 52.322 |
| 0.7361111111111112 | 46.695 |
| 0.7368055555555556 | 42.483 |
| 0.7374999999999999 | 38.28 |
| 0.7381944444444444 | 34.086 |
| 0.7388888888888889 | 29.905 |
| 0.7395833333333334 | 25.736 |
| 0.7402777777777777 | 22.965 |
| 0.7409722222222223 | 20.201 |
| 0.7416666666666667 | 16.069 |
| 0.7423611111111111 | 14.696 |
| 0.7430555555555555 | 11.956 |
| 0.74375 | 10.589 |
| 0.7444444444444445 | 7.862 |
| 0.7451388888888889 | 6.503 |
| 0.7458333333333332 | 5.146 |
| 0.7465277777777778 | 3.791 |
| 0.7472222222222222 | 3.791 |
| 0.7479166666666667 | 2.439 |
| 0.748611111111111 | 1.09 |
| 0.7493055555555556 | 1.09 |
| 0.75 | 1.09 |
| 0.7506944444444444 | 1.09 |
| 0.751388888888889 | -0.256 |
| 0.7520833333333333 | -0.256 |
| 0.7527777777777778 | -0.256 |
| 0.7534722222222222 | -0.256 |
| 0.7541666666666668 | -0.256 |
| 0.7548611111111111 | -0.256 |
| 0.7555555555555555 | -0.256 |
| 0.75625 | -0.256 |
| 0.7569444444444445 | -0.256 |
| 0.7576388888888889 | -0.256 |
| 0.7583333333333333 | -0.256 |
| 0.7590277777777777 | -0.256 |
| 0.7597222222222223 | -0.256 |
| 0.7604166666666666 | -0.256 |
| 0.7611111111111111 | -0.256 |
| 0.7618055555555556 | -0.256 |
| 0.7625000000000001 | -0.256 |
| 0.7631944444444444 | -0.256 |
| 0.7638888888888888 | -0.256 |
| 0.7645833333333334 | -0.256 |
| 0.7652777777777778 | -0.256 |
| 0.7659722222222222 | -0.256 |
| 0.7666666666666666 | -0.256 |
| 0.7673611111111112 | -0.256 |
| 0.7680555555555556 | -0.256 |
| 0.7687499999999999 | -0.256 |
| 0.7694444444444444 | -0.256 |
| 0.7701388888888889 | -0.256 |
| 0.7708333333333334 | -0.256 |
| 0.7715277777777777 | -0.256 |
| 0.7722222222222223 | -0.256 |
| 0.7729166666666667 | -0.256 |
| 0.7736111111111111 | -0.256 |
| 0.7743055555555555 | -0.256 |
| 0.775 | -0.256 |
| 0.7756944444444445 | -0.256 |
| 0.7763888888888889 | -0.256 |
| 0.7770833333333332 | -0.256 |
| 0.7777777777777778 | -0.256 |
| 0.7784722222222222 | -0.256 |
| 0.7791666666666667 | -0.256 |
| 0.779861111111111 | -0.256 |
| 0.7805555555555556 | -0.256 |
| 0.78125 | -0.256 |
| 0.7819444444444444 | -0.256 |
| 0.782638888888889 | -0.256 |
| 0.7833333333333333 | -0.256 |
| 0.7840277777777778 | -0.256 |
| 0.7847222222222222 | -0.256 |
| 0.7854166666666668 | -0.256 |
| 0.7861111111111111 | -0.256 |
| 0.7868055555555555 | -0.256 |
| 0.7875 | -0.256 |
| 0.7881944444444445 | -0.256 |
| 0.7888888888888889 | -0.256 |
| 0.7895833333333333 | -0.256 |
| 0.7902777777777777 | -0.256 |
| 0.7909722222222223 | -0.256 |
| 0.7916666666666666 | -0.256 |
| 0.7923611111111111 | -0.256 |
| 0.7930555555555556 | -0.256 |
| 0.7937500000000001 | -0.256 |
| 0.7944444444444444 | -0.256 |
| 0.7951388888888888 | -0.256 |
| 0.7958333333333334 | -0.256 |
| 0.7965277777777778 | -0.256 |
| 0.7972222222222222 | -0.256 |
| 0.7979166666666666 | -0.256 |
| 0.7986111111111112 | -0.256 |
| 0.7993055555555556 | -0.256 |
| 0.7999999999999999 | -0.256 |
| 0.8006944444444444 | -0.256 |
| 0.8013888888888889 | -0.256 |
| 0.8020833333333334 | -0.256 |
| 0.8027777777777777 | -0.256 |
| 0.8034722222222223 | -0.256 |
| 0.8041666666666667 | -0.256 |
| 0.8048611111111111 | -0.256 |
| 0.8055555555555555 | -0.256 |
| 0.80625 | -0.256 |
| 0.8069444444444445 | -0.256 |
| 0.8076388888888889 | -0.256 |
| 0.8083333333333332 | -0.256 |
| 0.8090277777777778 | -0.256 |
| 0.8097222222222222 | -0.256 |
| 0.8104166666666667 | -0.256 |
| 0.811111111111111 | -0.256 |
| 0.8118055555555556 | -0.256 |
| 0.8125 | -0.256 |
| 0.8131944444444444 | -0.256 |
| 0.813888888888889 | -0.256 |
| 0.8145833333333333 | -0.256 |
| 0.8152777777777778 | -0.256 |
| 0.8159722222222222 | -0.256 |
| 0.8166666666666668 | -0.256 |
| 0.8173611111111111 | -0.256 |
| 0.8180555555555555 | -0.256 |
| 0.81875 | -0.256 |
| 0.8194444444444445 | -0.256 |
| 0.8201388888888889 | -0.256 |
| 0.8208333333333333 | -0.256 |
| 0.8215277777777777 | -0.256 |
| 0.8222222222222223 | -0.256 |
| 0.8229166666666666 | -0.256 |
| 0.8236111111111111 | -0.256 |
| 0.8243055555555556 | -0.256 |
| 0.8250000000000001 | -0.256 |
| 0.8256944444444444 | -0.256 |
| 0.8263888888888888 | -0.256 |
| 0.8270833333333334 | -0.256 |
| 0.8277777777777778 | -0.256 |
| 0.8284722222222222 | -0.256 |
| 0.8291666666666666 | -0.256 |
| 0.8298611111111112 | -0.256 |
| 0.8305555555555556 | -0.256 |
| 0.8312499999999999 | -0.256 |
| 0.8319444444444444 | -0.256 |
| 0.8326388888888889 | -0.256 |
| 0.8333333333333334 | -0.256 |
| 0.8340277777777777 | -0.256 |
| 0.8347222222222223 | -0.256 |
| 0.8354166666666667 | -0.256 |
| 0.8361111111111111 | -0.256 |
| 0.8368055555555555 | -0.256 |
| 0.8375 | -0.256 |
| 0.8381944444444445 | -0.256 |
| 0.8388888888888889 | -0.256 |
| 0.8395833333333332 | -0.256 |
| 0.8402777777777778 | -0.256 |
| 0.8409722222222222 | -0.256 |
| 0.8416666666666667 | -0.256 |
| 0.842361111111111 | -0.256 |
| 0.8430555555555556 | -0.256 |
| 0.84375 | -0.256 |
| 0.8444444444444444 | -0.256 |
| 0.845138888888889 | -0.256 |
| 0.8458333333333333 | -0.256 |
| 0.8465277777777778 | -0.256 |
| 0.8472222222222222 | -0.256 |
| 0.8479166666666668 | -0.256 |
| 0.8486111111111111 | -0.256 |
| 0.8493055555555555 | -0.256 |
| 0.85 | -0.256 |
| 0.8506944444444445 | -0.256 |
| 0.8513888888888889 | -0.256 |
| 0.8520833333333333 | -0.256 |
| 0.8527777777777777 | -0.256 |
| 0.8534722222222223 | -0.256 |
| 0.8541666666666666 | -0.256 |
| 0.8548611111111111 | -0.256 |
| 0.8555555555555556 | -0.256 |
| 0.8562500000000001 | -0.256 |
| 0.8569444444444444 | -0.256 |
| 0.8576388888888888 | -0.256 |
| 0.8583333333333334 | -0.256 |
| 0.8590277777777778 | -0.256 |
| 0.8597222222222222 | -0.256 |
| 0.8604166666666666 | -0.256 |
| 0.8611111111111112 | -0.256 |
| 0.8618055555555556 | -0.256 |
| 0.8624999999999999 | -0.256 |
| 0.8631944444444444 | -0.256 |
| 0.8638888888888889 | -0.256 |
| 0.8645833333333334 | -0.256 |
| 0.8652777777777777 | -0.256 |
| 0.8659722222222223 | -0.256 |
| 0.8666666666666667 | -0.256 |
| 0.8673611111111111 | -0.256 |
| 0.8680555555555555 | -0.256 |
| 0.86875 | -0.256 |
| 0.8694444444444445 | -0.256 |
| 0.8701388888888889 | -0.256 |
| 0.8708333333333332 | -0.256 |
| 0.8715277777777778 | -0.256 |
| 0.8722222222222222 | -0.256 |
| 0.8729166666666667 | -0.256 |
| 0.873611111111111 | -0.256 |
| 0.8743055555555556 | -0.256 |
| 0.875 | -0.256 |
| 0.8756944444444444 | -0.256 |
| 0.876388888888889 | -0.256 |
| 0.8770833333333333 | -0.256 |
| 0.8777777777777778 | -0.256 |
| 0.8784722222222222 | -0.256 |
| 0.8791666666666668 | -0.256 |
| 0.8798611111111111 | -0.256 |
| 0.8805555555555555 | -0.256 |
| 0.88125 | -0.256 |
| 0.8819444444444445 | -0.256 |
| 0.8826388888888889 | -0.256 |
| 0.8833333333333333 | -0.256 |
| 0.8840277777777777 | -0.256 |
| 0.8847222222222223 | -0.256 |
| 0.8854166666666666 | -0.256 |
| 0.8861111111111111 | -0.256 |
| 0.8868055555555556 | -0.256 |
| 0.8875000000000001 | -0.256 |
| 0.8881944444444444 | -0.256 |
| 0.8888888888888888 | -0.256 |
| 0.8895833333333334 | -0.256 |
| 0.8902777777777778 | -0.256 |
| 0.8909722222222222 | -0.256 |
| 0.8916666666666666 | -0.256 |
| 0.8923611111111112 | -0.256 |
| 0.8930555555555556 | -0.256 |
| 0.8937499999999999 | -0.256 |
| 0.8944444444444444 | -0.256 |
| 0.8951388888888889 | -0.256 |
| 0.8958333333333334 | -0.256 |
| 0.8965277777777777 | -0.256 |
| 0.8972222222222223 | -0.256 |
| 0.8979166666666667 | -0.256 |
| 0.8986111111111111 | -0.256 |
| 0.8993055555555555 | -0.256 |
| 0.9 | -0.256 |
| 0.9006944444444445 | -0.256 |
| 0.9013888888888889 | -0.256 |
| 0.9020833333333332 | -0.256 |
| 0.9027777777777778 | -0.256 |
| 0.9034722222222222 | -0.256 |
| 0.9041666666666667 | -0.256 |
| 0.904861111111111 | -0.256 |
| 0.9055555555555556 | -0.256 |
| 0.90625 | -0.256 |
| 0.9069444444444444 | -0.256 |
| 0.907638888888889 | -0.256 |
| 0.9083333333333333 | -0.256 |
| 0.9090277777777778 | -0.256 |
| 0.9097222222222222 | -0.256 |
| 0.9104166666666668 | -0.256 |
| 0.9111111111111111 | -0.256 |
| 0.9118055555555555 | -0.256 |
| 0.9125 | -0.256 |
| 0.9131944444444445 | -0.256 |
| 0.9138888888888889 | -0.256 |
| 0.9145833333333333 | -0.256 |
| 0.9152777777777777 | -0.256 |
| 0.9159722222222223 | -0.256 |
| 0.9166666666666666 | -0.256 |
| 0.9173611111111111 | -0.256 |
| 0.9180555555555556 | -0.256 |
| 0.9187500000000001 | -0.256 |
| 0.9194444444444444 | -0.256 |
| 0.9201388888888888 | -0.256 |
| 0.9208333333333334 | -0.256 |
| 0.9215277777777778 | -0.256 |
| 0.9222222222222222 | -0.256 |
| 0.9229166666666666 | -0.256 |
| 0.9236111111111112 | -0.256 |
| 0.9243055555555556 | -0.256 |
| 0.9249999999999999 | -0.256 |
| 0.9256944444444444 | -0.256 |
| 0.9263888888888889 | -0.256 |
| 0.9270833333333334 | -0.256 |
| 0.9277777777777777 | -0.256 |
| 0.9284722222222223 | -0.256 |
| 0.9291666666666667 | -0.256 |
| 0.9298611111111111 | -0.256 |
| 0.9305555555555555 | -0.256 |
| 0.93125 | -0.256 |
| 0.9319444444444445 | -0.256 |
| 0.9326388888888889 | -0.256 |
| 0.9333333333333332 | -0.256 |
| 0.9340277777777778 | -0.256 |
| 0.9347222222222222 | -0.256 |
| 0.9354166666666667 | -0.256 |
| 0.936111111111111 | -0.256 |
| 0.9368055555555556 | -0.256 |
| 0.9375 | -0.256 |
| 0.9381944444444444 | -0.256 |
| 0.938888888888889 | -0.256 |
| 0.9395833333333333 | -0.256 |
| 0.9402777777777778 | -0.256 |
| 0.9409722222222222 | -0.256 |
| 0.9416666666666668 | -0.256 |
| 0.9423611111111111 | -0.256 |
| 0.9430555555555555 | -0.256 |
| 0.94375 | -0.256 |
| 0.9444444444444445 | -0.256 |
| 0.9451388888888889 | -0.256 |
| 0.9458333333333333 | -0.256 |
| 0.9465277777777777 | -0.256 |
| 0.9472222222222223 | -0.256 |
| 0.9479166666666666 | -0.256 |
| 0.9486111111111111 | -0.256 |
| 0.9493055555555556 | -0.256 |
| 0.9500000000000001 | -0.256 |
| 0.9506944444444444 | -0.256 |
| 0.9513888888888888 | -0.256 |
| 0.9520833333333334 | -0.256 |
| 0.9527777777777778 | -0.256 |
| 0.9534722222222222 | -0.256 |
| 0.9541666666666666 | -0.256 |
| 0.9548611111111112 | -0.256 |
| 0.9555555555555556 | -0.256 |
| 0.9562499999999999 | -0.256 |
| 0.9569444444444444 | -0.256 |
| 0.9576388888888889 | -0.256 |
| 0.9583333333333334 | -0.256 |
| 0.9590277777777777 | -0.256 |
| 0.9597222222222223 | -0.256 |
| 0.9604166666666667 | -0.256 |
| 0.9611111111111111 | -0.256 |
| 0.9618055555555555 | -0.256 |
| 0.9625 | -0.256 |
| 0.9631944444444445 | -0.256 |
| 0.9638888888888889 | -0.256 |
| 0.9645833333333332 | -0.256 |
| 0.9652777777777778 | -0.256 |
| 0.9659722222222222 | -0.256 |
| 0.9666666666666667 | -0.256 |
| 0.967361111111111 | -0.256 |
| 0.9680555555555556 | -0.256 |
| 0.96875 | -0.256 |
| 0.9694444444444444 | -0.256 |
| 0.970138888888889 | -0.256 |
| 0.9708333333333333 | -0.256 |
| 0.9715277777777778 | -0.256 |
| 0.9722222222222222 | -0.256 |
| 0.9729166666666668 | -0.256 |
| 0.9736111111111111 | -0.256 |
| 0.9743055555555555 | -0.256 |
| 0.975 | -0.256 |
| 0.9756944444444445 | -0.256 |
| 0.9763888888888889 | -0.256 |
| 0.9770833333333333 | -0.256 |
| 0.9777777777777777 | -0.256 |
| 0.9784722222222223 | -0.256 |
| 0.9791666666666666 | -0.256 |
| 0.9798611111111111 | -0.256 |
| 0.9805555555555556 | -0.256 |
| 0.9812500000000001 | -0.256 |
| 0.9819444444444444 | -0.256 |
| 0.9826388888888888 | -0.256 |
| 0.9833333333333334 | -0.256 |
| 0.9840277777777778 | -0.256 |
| 0.9847222222222222 | -0.256 |
| 0.9854166666666666 | -0.256 |
| 0.9861111111111112 | -0.256 |
| 0.9868055555555556 | -0.256 |
| 0.9874999999999999 | -0.256 |
| 0.9881944444444444 | -0.256 |
| 0.9888888888888889 | -0.256 |
| 0.9895833333333334 | -0.256 |
| 0.9902777777777777 | -0.256 |
| 0.9909722222222223 | -0.256 |
| 0.9916666666666667 | -0.256 |
| 0.9923611111111111 | -0.256 |
| 0.9930555555555555 | -0.256 |
| 0.99375 | -0.256 |
| 0.9944444444444445 | -0.256 |
| 0.9951388888888889 | -0.256 |
| 0.9958333333333332 | -0.256 |
| 0.9965277777777778 | -0.256 |
| 0.9972222222222222 | -0.256 |
| 0.9979166666666667 | -0.256 |
| 0.998611111111111 | -0.256 |
| 0.9993055555555556 | 0 |